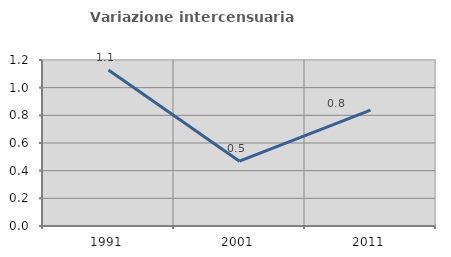
| Category | Variazione intercensuaria annua |
|---|---|
| 1991.0 | 1.127 |
| 2001.0 | 0.468 |
| 2011.0 | 0.838 |